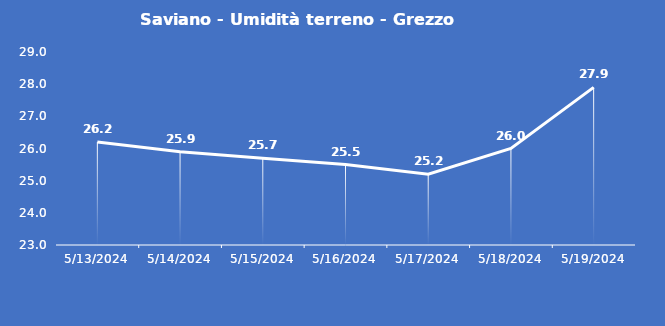
| Category | Saviano - Umidità terreno - Grezzo (%VWC) |
|---|---|
| 5/13/24 | 26.2 |
| 5/14/24 | 25.9 |
| 5/15/24 | 25.7 |
| 5/16/24 | 25.5 |
| 5/17/24 | 25.2 |
| 5/18/24 | 26 |
| 5/19/24 | 27.9 |